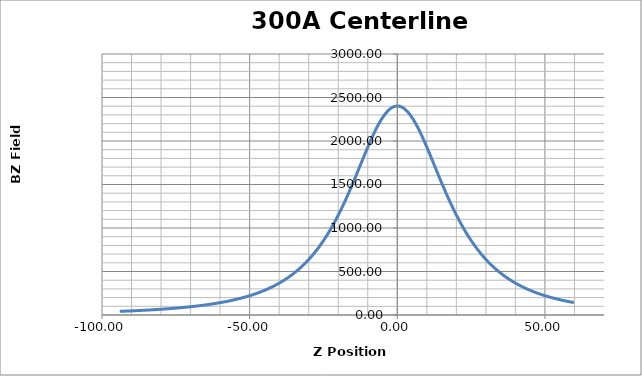
| Category | Series 0 |
|---|---|
| -94.001 | 41.99 |
| -93.8 | 42.26 |
| -93.602 | 42.48 |
| -93.403 | 42.77 |
| -93.202 | 43.03 |
| -93.001 | 43.31 |
| -92.804 | 43.57 |
| -92.604 | 43.82 |
| -92.403 | 44.13 |
| -92.203 | 44.38 |
| -92.006 | 44.63 |
| -91.806 | 44.94 |
| -91.60300000000001 | 45.21 |
| -91.402 | 45.51 |
| -91.205 | 45.77 |
| -91.004 | 46.05 |
| -90.802 | 46.33 |
| -90.602 | 46.63 |
| -90.405 | 46.95 |
| -90.20400000000001 | 47.26 |
| -90.004 | 47.52 |
| -89.804 | 47.85 |
| -89.607 | 48.15 |
| -89.406 | 48.44 |
| -89.20400000000001 | 48.76 |
| -89.003 | 49.09 |
| -88.806 | 49.36 |
| -88.605 | 49.69 |
| -88.404 | 50.02 |
| -88.20400000000001 | 50.33 |
| -88.005 | 50.64 |
| -87.805 | 51 |
| -87.604 | 51.31 |
| -87.404 | 51.64 |
| -87.208 | 52 |
| -87.007 | 52.29 |
| -86.805 | 52.66 |
| -86.604 | 52.99 |
| -86.406 | 53.37 |
| -86.206 | 53.71 |
| -86.004 | 54.07 |
| -85.804 | 54.41 |
| -85.606 | 54.75 |
| -85.405 | 55.13 |
| -85.20400000000001 | 55.47 |
| -85.004 | 55.88 |
| -84.807 | 56.22 |
| -84.607 | 56.62 |
| -84.406 | 56.98 |
| -84.20400000000001 | 57.37 |
| -84.006 | 57.77 |
| -83.806 | 58.12 |
| -83.604 | 58.53 |
| -83.403 | 58.95 |
| -83.205 | 59.33 |
| -83.006 | 59.74 |
| -82.803 | 60.15 |
| -82.60300000000001 | 60.53 |
| -82.406 | 60.94 |
| -82.20700000000001 | 61.34 |
| -82.006 | 61.76 |
| -81.805 | 62.19 |
| -81.607 | 62.61 |
| -81.407 | 63.05 |
| -81.205 | 63.49 |
| -81.005 | 63.93 |
| -80.806 | 64.38 |
| -80.606 | 64.8 |
| -80.405 | 65.25 |
| -80.20400000000001 | 65.71 |
| -80.007 | 66.17 |
| -79.807 | 66.62 |
| -79.607 | 67.08 |
| -79.406 | 67.56 |
| -79.209 | 68.02 |
| -79.00800000000001 | 68.46 |
| -78.806 | 68.94 |
| -78.605 | 69.45 |
| -78.407 | 69.92 |
| -78.20700000000001 | 70.43 |
| -78.005 | 70.91 |
| -77.804 | 71.45 |
| -77.607 | 71.95 |
| -77.408 | 72.44 |
| -77.207 | 72.98 |
| -77.007 | 73.47 |
| -76.809 | 74.02 |
| -76.60900000000001 | 74.57 |
| -76.406 | 75.11 |
| -76.205 | 75.62 |
| -76.007 | 76.17 |
| -75.807 | 76.71 |
| -75.606 | 77.27 |
| -75.404 | 77.82 |
| -75.207 | 78.4 |
| -75.00800000000001 | 78.94 |
| -74.806 | 79.53 |
| -74.605 | 80.1 |
| -74.409 | 80.68 |
| -74.208 | 81.26 |
| -74.006 | 81.87 |
| -73.805 | 82.46 |
| -73.607 | 83.08 |
| -73.40700000000001 | 83.7 |
| -73.206 | 84.31 |
| -73.005 | 85 |
| -72.807 | 85.58 |
| -72.607 | 86.2 |
| -72.406 | 86.85 |
| -72.205 | 87.45 |
| -72.00800000000001 | 88.13 |
| -71.809 | 88.77 |
| -71.607 | 89.47 |
| -71.406 | 90.14 |
| -71.207 | 90.81 |
| -71.00800000000001 | 91.5 |
| -70.806 | 92.22 |
| -70.605 | 92.92 |
| -70.40700000000001 | 93.61 |
| -70.208 | 94.29 |
| -70.006 | 95 |
| -69.804 | 95.77 |
| -69.608 | 96.47 |
| -69.409 | 97.24 |
| -69.207 | 97.97 |
| -69.006 | 98.74 |
| -68.808 | 99.48 |
| -68.608 | 100.25 |
| -68.405 | 101.07 |
| -68.20400000000001 | 101.83 |
| -68.006 | 102.62 |
| -67.807 | 103.43 |
| -67.606 | 104.23 |
| -67.405 | 105.07 |
| -67.206 | 105.88 |
| -67.00800000000001 | 106.71 |
| -66.807 | 107.55 |
| -66.607 | 108.41 |
| -66.408 | 109.25 |
| -66.208 | 110.15 |
| -66.006 | 111.02 |
| -65.805 | 111.88 |
| -65.606 | 112.79 |
| -65.408 | 113.68 |
| -65.207 | 114.61 |
| -65.006 | 115.54 |
| -64.806 | 116.48 |
| -64.60900000000001 | 117.38 |
| -64.408 | 118.33 |
| -64.207 | 119.32 |
| -64.00800000000001 | 120.26 |
| -63.81 | 121.21 |
| -63.607 | 122.2 |
| -63.405 | 123.24 |
| -63.206 | 124.24 |
| -63.008 | 125.22 |
| -62.807 | 126.28 |
| -62.605000000000004 | 127.34 |
| -62.407000000000004 | 128.39 |
| -62.209 | 129.42 |
| -62.008 | 130.48 |
| -61.807 | 131.59 |
| -61.608000000000004 | 132.67 |
| -61.411 | 133.75 |
| -61.208000000000006 | 134.9 |
| -61.006 | 136.06 |
| -60.806000000000004 | 137.2 |
| -60.608000000000004 | 138.35 |
| -60.406 | 139.5 |
| -60.205000000000005 | 140.71 |
| -60.007000000000005 | 141.87 |
| -59.809000000000005 | 143.09 |
| -59.608000000000004 | 144.31 |
| -59.407000000000004 | 145.55 |
| -59.209 | 146.75 |
| -59.011 | 148.01 |
| -58.809000000000005 | 149.3 |
| -58.607 | 150.58 |
| -58.407000000000004 | 151.89 |
| -58.208000000000006 | 153.2 |
| -58.007000000000005 | 154.53 |
| -57.805 | 155.89 |
| -57.606 | 157.25 |
| -57.408 | 158.63 |
| -57.208000000000006 | 160 |
| -57.006 | 161.43 |
| -56.808 | 162.8 |
| -56.611000000000004 | 164.19 |
| -56.411 | 165.66 |
| -56.208000000000006 | 167.19 |
| -56.009 | 168.62 |
| -55.81 | 170.14 |
| -55.608000000000004 | 171.67 |
| -55.406 | 173.23 |
| -55.206 | 174.75 |
| -55.009 | 176.28 |
| -54.808 | 177.88 |
| -54.607 | 179.47 |
| -54.409 | 181.11 |
| -54.212 | 182.69 |
| -54.010000000000005 | 184.36 |
| -53.809000000000005 | 186.03 |
| -53.609 | 187.73 |
| -53.410000000000004 | 189.44 |
| -53.208000000000006 | 191.22 |
| -53.005 | 192.94 |
| -52.806000000000004 | 194.75 |
| -52.608000000000004 | 196.5 |
| -52.408 | 198.31 |
| -52.206 | 200.17 |
| -52.008 | 202.01 |
| -51.811 | 203.85 |
| -51.61 | 205.8 |
| -51.408 | 207.7 |
| -51.209 | 209.63 |
| -51.010000000000005 | 211.61 |
| -50.808 | 213.61 |
| -50.606 | 215.63 |
| -50.406 | 217.7 |
| -50.208000000000006 | 219.74 |
| -50.007000000000005 | 221.83 |
| -49.806000000000004 | 223.93 |
| -49.607 | 226.08 |
| -49.410000000000004 | 228.2 |
| -49.209 | 230.35 |
| -49.008 | 232.57 |
| -48.808 | 234.84 |
| -48.61 | 237.08 |
| -48.408 | 239.39 |
| -48.206 | 241.75 |
| -48.005 | 244.1 |
| -47.808 | 246.42 |
| -47.607 | 248.84 |
| -47.405 | 251.29 |
| -47.206 | 253.72 |
| -47.010000000000005 | 256.19 |
| -46.809000000000005 | 258.73 |
| -46.608000000000004 | 261.3 |
| -46.409 | 263.86 |
| -46.211000000000006 | 266.45 |
| -46.009 | 269.12 |
| -45.807 | 271.84 |
| -45.606 | 274.57 |
| -45.409 | 277.3 |
| -45.207 | 280.06 |
| -45.006 | 282.89 |
| -44.806000000000004 | 285.75 |
| -44.609 | 288.59 |
| -44.408 | 291.54 |
| -44.207 | 294.5 |
| -44.008 | 297.5 |
| -43.81 | 300.49 |
| -43.609 | 303.57 |
| -43.407000000000004 | 306.68 |
| -43.207 | 309.82 |
| -43.009 | 312.96 |
| -42.808 | 316.22 |
| -42.606 | 319.52 |
| -42.406 | 322.82 |
| -42.209 | 326.12 |
| -42.008 | 329.51 |
| -41.806000000000004 | 332.99 |
| -41.607 | 336.43 |
| -41.410000000000004 | 339.87 |
| -41.21 | 343.44 |
| -41.007000000000005 | 347.12 |
| -40.807 | 350.74 |
| -40.61 | 354.4 |
| -40.408 | 358.17 |
| -40.206 | 362 |
| -40.006 | 365.84 |
| -39.808 | 369.69 |
| -39.607 | 373.65 |
| -39.406 | 377.66 |
| -39.207 | 381.68 |
| -39.010000000000005 | 385.72 |
| -38.809000000000005 | 389.87 |
| -38.607 | 394.12 |
| -38.407000000000004 | 398.39 |
| -38.209 | 402.65 |
| -38.007000000000005 | 407.08 |
| -37.806000000000004 | 411.51 |
| -37.605000000000004 | 416.02 |
| -37.408 | 420.48 |
| -37.207 | 425.11 |
| -37.006 | 429.77 |
| -36.806000000000004 | 434.48 |
| -36.609 | 439.21 |
| -36.409 | 444.06 |
| -36.207 | 448.98 |
| -36.007000000000005 | 453.95 |
| -35.809000000000005 | 458.94 |
| -35.608000000000004 | 464.08 |
| -35.406 | 469.29 |
| -35.205000000000005 | 474.53 |
| -35.008 | 479.79 |
| -34.808 | 485.15 |
| -34.605000000000004 | 490.67 |
| -34.406 | 496.16 |
| -34.209 | 501.65 |
| -34.008 | 507.38 |
| -33.807 | 513.14 |
| -33.607 | 518.89 |
| -33.409 | 524.7 |
| -33.208000000000006 | 530.72 |
| -33.006 | 536.78 |
| -32.805 | 542.92 |
| -32.608000000000004 | 549.08 |
| -32.408 | 555.37 |
| -32.206 | 561.75 |
| -32.005 | 568.24 |
| -31.808 | 574.67 |
| -31.608000000000004 | 581.29 |
| -31.408 | 588.02 |
| -31.207 | 594.81 |
| -31.010000000000005 | 601.59 |
| -30.809000000000005 | 608.55 |
| -30.607 | 615.68 |
| -30.407000000000004 | 622.88 |
| -30.209000000000003 | 629.97 |
| -30.009 | 637.34 |
| -29.807000000000002 | 644.86 |
| -29.60600000000001 | 652.41 |
| -29.409000000000006 | 659.92 |
| -29.209000000000003 | 667.65 |
| -29.007000000000005 | 675.52 |
| -28.807000000000002 | 683.43 |
| -28.61 | 691.35 |
| -28.409999999999997 | 699.48 |
| -28.207000000000008 | 707.79 |
| -28.007000000000005 | 716.17 |
| -27.808999999999997 | 724.51 |
| -27.60900000000001 | 733.1 |
| -27.406999999999996 | 741.85 |
| -27.207000000000008 | 750.62 |
| -27.009 | 759.36 |
| -26.808999999999997 | 768.36 |
| -26.607 | 777.56 |
| -26.406999999999996 | 786.76 |
| -26.210000000000008 | 795.97 |
| -26.009 | 805.41 |
| -25.807000000000002 | 815.09 |
| -25.607 | 824.77 |
| -25.409000000000006 | 834.43 |
| -25.209000000000003 | 844.42 |
| -25.007000000000005 | 854.53 |
| -24.805999999999997 | 864.74 |
| -24.608000000000004 | 874.94 |
| -24.408 | 885.31 |
| -24.206000000000003 | 895.93 |
| -24.006 | 906.55 |
| -23.808999999999997 | 917.22 |
| -23.61 | 928.08 |
| -23.408 | 939.22 |
| -23.207000000000008 | 950.47 |
| -23.009 | 961.62 |
| -22.808999999999997 | 973.12 |
| -22.607 | 984.76 |
| -22.406000000000006 | 996.51 |
| -22.208 | 1008.2 |
| -22.007999999999996 | 1020.21 |
| -21.805999999999997 | 1032.39 |
| -21.60600000000001 | 1044.66 |
| -21.409000000000006 | 1056.77 |
| -21.209000000000003 | 1069.28 |
| -21.007999999999996 | 1081.95 |
| -20.807000000000002 | 1094.78 |
| -20.61 | 1107.49 |
| -20.409000000000006 | 1120.57 |
| -20.207000000000008 | 1133.87 |
| -20.006 | 1147.2 |
| -19.808999999999997 | 1160.43 |
| -19.608000000000004 | 1174 |
| -19.406000000000006 | 1187.8 |
| -19.205 | 1201.64 |
| -19.007000000000005 | 1215.44 |
| -18.808000000000007 | 1229.42 |
| -18.607 | 1243.66 |
| -18.406999999999996 | 1257.99 |
| -18.209000000000003 | 1272.29 |
| -18.009 | 1286.83 |
| -17.805999999999997 | 1301.66 |
| -17.60600000000001 | 1316.48 |
| -17.408 | 1331.21 |
| -17.208 | 1346.23 |
| -17.006 | 1361.49 |
| -16.805000000000007 | 1376.78 |
| -16.608000000000004 | 1391.95 |
| -16.408 | 1407.36 |
| -16.206000000000003 | 1423.02 |
| -16.006 | 1438.72 |
| -15.808999999999997 | 1454.17 |
| -15.608000000000004 | 1470.05 |
| -15.406000000000006 | 1486.12 |
| -15.204999999999998 | 1502.19 |
| -15.007999999999996 | 1518.04 |
| -14.808000000000007 | 1534.17 |
| -14.606000000000009 | 1550.54 |
| -14.405000000000001 | 1566.87 |
| -14.207999999999998 | 1583 |
| -14.007999999999996 | 1599.38 |
| -13.805999999999997 | 1615.87 |
| -13.606000000000009 | 1632.4 |
| -13.408000000000001 | 1648.73 |
| -13.209000000000003 | 1665.2 |
| -13.007000000000005 | 1681.92 |
| -12.805000000000007 | 1698.65 |
| -12.607 | 1715.06 |
| -12.408000000000001 | 1731.52 |
| -12.206000000000003 | 1748.22 |
| -12.006 | 1764.88 |
| -11.807000000000002 | 1781.24 |
| -11.608000000000004 | 1797.7 |
| -11.406000000000006 | 1814.35 |
| -11.204999999999998 | 1830.84 |
| -11.007000000000005 | 1847.01 |
| -10.808999999999997 | 1863.21 |
| -10.606000000000009 | 1879.7 |
| -10.405000000000001 | 1895.96 |
| -10.207000000000008 | 1911.89 |
| -10.007999999999996 | 1927.78 |
| -9.805999999999997 | 1943.77 |
| -9.605000000000004 | 1959.58 |
| -9.408000000000001 | 1975.05 |
| -9.207999999999998 | 1990.52 |
| -9.006 | 2005.98 |
| -8.805000000000007 | 2021.24 |
| -8.608000000000004 | 2036.03 |
| -8.408000000000001 | 2050.87 |
| -8.206000000000003 | 2065.66 |
| -8.004999999999995 | 2080.22 |
| -7.807000000000002 | 2094.42 |
| -7.606999999999999 | 2108.47 |
| -7.405000000000001 | 2122.44 |
| -7.204999999999998 | 2136.04 |
| -7.007000000000005 | 2149.33 |
| -6.808000000000007 | 2162.36 |
| -6.606000000000009 | 2175.37 |
| -6.406000000000006 | 2187.94 |
| -6.207999999999998 | 2200.18 |
| -6.009 | 2212.13 |
| -5.807000000000002 | 2223.92 |
| -5.606000000000009 | 2235.4 |
| -5.4069999999999965 | 2246.44 |
| -5.207999999999998 | 2257.21 |
| -5.006 | 2267.71 |
| -4.805000000000007 | 2277.94 |
| -4.606999999999999 | 2287.54 |
| -4.408000000000001 | 2296.93 |
| -4.206000000000003 | 2306.06 |
| -4.0049999999999955 | 2314.77 |
| -3.808000000000007 | 2322.95 |
| -3.608000000000004 | 2330.79 |
| -3.4069999999999965 | 2338.39 |
| -3.206000000000003 | 2345.51 |
| -3.007000000000005 | 2352.19 |
| -2.808000000000007 | 2358.52 |
| -2.6069999999999993 | 2364.47 |
| -2.405000000000001 | 2369.96 |
| -2.207000000000008 | 2375 |
| -2.0079999999999956 | 2379.65 |
| -1.8059999999999974 | 2383.88 |
| -1.6039999999999992 | 2387.68 |
| -1.406000000000006 | 2390.98 |
| -1.2079999999999984 | 2393.89 |
| -1.007000000000005 | 2396.39 |
| -0.8059999999999974 | 2398.42 |
| -0.6080000000000041 | 2399.96 |
| -0.40800000000000125 | 2401.1 |
| -0.20600000000000307 | 2401.81 |
| -0.0049999999999954525 | 2402.11 |
| 0.19299999999999784 | 2401.87 |
| 0.3919999999999959 | 2401.27 |
| 0.5939999999999941 | 2400.16 |
| 0.7950000000000017 | 2398.63 |
| 0.992999999999995 | 2396.68 |
| 1.191999999999993 | 2394.3 |
| 1.3930000000000007 | 2391.43 |
| 1.593999999999994 | 2388.11 |
| 1.7920000000000016 | 2384.44 |
| 1.9909999999999997 | 2380.3 |
| 2.192999999999998 | 2375.72 |
| 2.394999999999996 | 2370.65 |
| 2.5930000000000035 | 2365.29 |
| 2.7920000000000016 | 2359.47 |
| 2.992999999999995 | 2353.15 |
| 3.194999999999993 | 2346.47 |
| 3.394999999999996 | 2339.38 |
| 3.5919999999999987 | 2332.03 |
| 3.793999999999997 | 2324.16 |
| 3.9950000000000045 | 2315.86 |
| 4.192999999999998 | 2307.35 |
| 4.390999999999991 | 2298.45 |
| 4.5930000000000035 | 2289.05 |
| 4.793999999999997 | 2279.3 |
| 4.994 | 2269.26 |
| 5.191999999999993 | 2258.99 |
| 5.393000000000001 | 2248.25 |
| 5.593999999999994 | 2237.14 |
| 5.793999999999997 | 2225.74 |
| 5.992000000000004 | 2214.18 |
| 6.192999999999998 | 2202.17 |
| 6.393999999999991 | 2189.86 |
| 6.593999999999994 | 2177.37 |
| 6.790999999999997 | 2164.75 |
| 6.992999999999995 | 2151.57 |
| 7.194000000000003 | 2138.11 |
| 7.393999999999991 | 2124.58 |
| 7.591999999999999 | 2110.84 |
| 7.792999999999992 | 2096.73 |
| 7.9950000000000045 | 2082.4 |
| 8.194000000000003 | 2067.99 |
| 8.391999999999996 | 2053.48 |
| 8.593000000000004 | 2038.59 |
| 8.793999999999997 | 2023.54 |
| 8.994 | 2008.38 |
| 9.191000000000003 | 1993.27 |
| 9.393 | 1977.69 |
| 9.593999999999994 | 1961.94 |
| 9.793999999999997 | 1946.23 |
| 9.992000000000004 | 1930.46 |
| 10.194000000000003 | 1914.43 |
| 10.393999999999991 | 1898.27 |
| 10.593999999999994 | 1882.13 |
| 10.792000000000002 | 1866.11 |
| 10.992999999999995 | 1849.73 |
| 11.194000000000003 | 1833.26 |
| 11.393999999999991 | 1816.81 |
| 11.590999999999994 | 1800.58 |
| 11.792000000000002 | 1784.03 |
| 11.992999999999995 | 1767.45 |
| 12.192999999999998 | 1750.92 |
| 12.391999999999996 | 1734.43 |
| 12.593000000000004 | 1717.82 |
| 12.795000000000002 | 1701.11 |
| 12.992999999999995 | 1684.65 |
| 13.191000000000003 | 1668.25 |
| 13.393 | 1651.67 |
| 13.594999999999999 | 1635 |
| 13.793999999999997 | 1618.57 |
| 13.992000000000004 | 1602.35 |
| 14.192999999999998 | 1585.9 |
| 14.393999999999991 | 1569.56 |
| 14.593000000000004 | 1553.32 |
| 14.790999999999997 | 1537.32 |
| 14.992999999999995 | 1521.08 |
| 15.194000000000003 | 1504.88 |
| 15.393999999999991 | 1488.88 |
| 15.590999999999994 | 1473.26 |
| 15.792999999999992 | 1457.32 |
| 15.994 | 1441.49 |
| 16.194000000000003 | 1425.83 |
| 16.391999999999996 | 1410.48 |
| 16.593000000000004 | 1394.98 |
| 16.793999999999997 | 1379.49 |
| 16.992999999999995 | 1364.37 |
| 17.189999999999998 | 1349.45 |
| 17.391999999999996 | 1334.35 |
| 17.593999999999994 | 1319.29 |
| 17.793999999999997 | 1304.52 |
| 17.992000000000004 | 1289.94 |
| 18.192999999999998 | 1275.39 |
| 18.39399999999999 | 1260.89 |
| 18.593000000000004 | 1246.58 |
| 18.790999999999997 | 1232.54 |
| 18.992000000000004 | 1218.45 |
| 19.192999999999998 | 1204.39 |
| 19.393 | 1190.65 |
| 19.589 | 1177.19 |
| 19.790999999999997 | 1163.55 |
| 19.992999999999995 | 1150 |
| 20.192999999999998 | 1136.72 |
| 20.39 | 1123.72 |
| 20.590999999999994 | 1110.68 |
| 20.792999999999992 | 1097.65 |
| 20.992999999999995 | 1084.89 |
| 21.189999999999998 | 1072.42 |
| 21.39099999999999 | 1059.83 |
| 21.593000000000004 | 1047.42 |
| 21.792 | 1035.16 |
| 21.989000000000004 | 1023.32 |
| 22.191000000000003 | 1011.21 |
| 22.391999999999996 | 999.29 |
| 22.592 | 987.57 |
| 22.789999999999992 | 976.09 |
| 22.991 | 964.61 |
| 23.191999999999993 | 953.22 |
| 23.393 | 942.02 |
| 23.590000000000003 | 931.12 |
| 23.790999999999997 | 920.11 |
| 23.992999999999995 | 909.18 |
| 24.191999999999993 | 898.54 |
| 24.39 | 888.12 |
| 24.590999999999994 | 877.68 |
| 24.792 | 867.22 |
| 24.992000000000004 | 857.06 |
| 25.189999999999998 | 847.08 |
| 25.39099999999999 | 837.09 |
| 25.593000000000004 | 827.2 |
| 25.792999999999992 | 817.5 |
| 25.989999999999995 | 808 |
| 26.191000000000003 | 798.5 |
| 26.393 | 789.08 |
| 26.593000000000004 | 779.87 |
| 26.789999999999992 | 770.85 |
| 26.991 | 761.79 |
| 27.192999999999998 | 752.84 |
| 27.393 | 744.02 |
| 27.590999999999994 | 735.47 |
| 27.792 | 726.84 |
| 27.992999999999995 | 718.33 |
| 28.192999999999998 | 709.99 |
| 28.39099999999999 | 701.8 |
| 28.592 | 693.65 |
| 28.792999999999992 | 685.48 |
| 28.992999999999995 | 677.58 |
| 29.191000000000003 | 669.79 |
| 29.391999999999996 | 662.03 |
| 29.593999999999994 | 654.3 |
| 29.793999999999997 | 646.79 |
| 29.991 | 639.36 |
| 30.191999999999993 | 632.02 |
| 30.39399999999999 | 624.67 |
| 30.593000000000004 | 617.56 |
| 30.789999999999992 | 610.55 |
| 30.991 | 603.51 |
| 31.192999999999998 | 596.6 |
| 31.393 | 589.77 |
| 31.590999999999994 | 583.1 |
| 31.792 | 576.44 |
| 31.994 | 569.82 |
| 32.194 | 563.36 |
| 32.39099999999999 | 557.08 |
| 32.592 | 550.76 |
| 32.794 | 544.5 |
| 32.995000000000005 | 538.34 |
| 33.19199999999999 | 532.38 |
| 33.391999999999996 | 526.38 |
| 33.593999999999994 | 520.42 |
| 33.794 | 514.58 |
| 33.990999999999985 | 508.89 |
| 34.19200000000001 | 503.17 |
| 34.394000000000005 | 497.51 |
| 34.593999999999994 | 491.97 |
| 34.792 | 486.59 |
| 34.992999999999995 | 481.18 |
| 35.19499999999999 | 475.84 |
| 35.39500000000001 | 470.58 |
| 35.59299999999999 | 465.45 |
| 35.792 | 460.37 |
| 35.994 | 455.28 |
| 36.19399999999999 | 450.26 |
| 36.39099999999999 | 445.39 |
| 36.591999999999985 | 440.49 |
| 36.79400000000001 | 435.7 |
| 36.995000000000005 | 430.91 |
| 37.192999999999984 | 426.25 |
| 37.393 | 421.65 |
| 37.595 | 417.07 |
| 37.79599999999999 | 412.55 |
| 37.992999999999995 | 408.13 |
| 38.192999999999984 | 403.73 |
| 38.394000000000005 | 399.42 |
| 38.593999999999994 | 395.13 |
| 38.791 | 390.97 |
| 38.99199999999999 | 386.81 |
| 39.19399999999999 | 382.67 |
| 39.39500000000001 | 378.59 |
| 39.59299999999999 | 374.63 |
| 39.79400000000001 | 370.64 |
| 39.99600000000001 | 366.7 |
| 40.196 | 362.82 |
| 40.394000000000005 | 359.03 |
| 40.593999999999994 | 355.3 |
| 40.79499999999999 | 351.57 |
| 40.99600000000001 | 347.87 |
| 41.192999999999984 | 344.27 |
| 41.393 | 340.72 |
| 41.595 | 337.14 |
| 41.79499999999999 | 333.64 |
| 41.99199999999999 | 330.24 |
| 42.192999999999984 | 326.84 |
| 42.394000000000005 | 323.47 |
| 42.593999999999994 | 320.14 |
| 42.793000000000006 | 316.85 |
| 42.994 | 313.61 |
| 43.19499999999999 | 310.43 |
| 43.39500000000001 | 307.24 |
| 43.591999999999985 | 304.17 |
| 43.791 | 301.08 |
| 43.992999999999995 | 297.98 |
| 44.19399999999999 | 294.99 |
| 44.391999999999996 | 292.07 |
| 44.59299999999999 | 289.1 |
| 44.79400000000001 | 286.18 |
| 44.995000000000005 | 283.35 |
| 45.19200000000001 | 280.51 |
| 45.393 | 277.74 |
| 45.59299999999999 | 274.95 |
| 45.79400000000001 | 272.23 |
| 45.99199999999999 | 269.55 |
| 46.19200000000001 | 266.9 |
| 46.393 | 264.28 |
| 46.593999999999994 | 261.66 |
| 46.792 | 259.11 |
| 46.99199999999999 | 256.6 |
| 47.19399999999999 | 254.06 |
| 47.394000000000005 | 251.54 |
| 47.591999999999985 | 249.15 |
| 47.793000000000006 | 246.73 |
| 47.995000000000005 | 244.35 |
| 48.19399999999999 | 242 |
| 48.393 | 239.67 |
| 48.591999999999985 | 237.38 |
| 48.79400000000001 | 235.11 |
| 48.995000000000005 | 232.84 |
| 49.19200000000001 | 230.65 |
| 49.391999999999996 | 228.46 |
| 49.593999999999994 | 226.29 |
| 49.79599999999999 | 224.15 |
| 49.992999999999995 | 222.03 |
| 50.19200000000001 | 219.93 |
| 50.394000000000005 | 217.88 |
| 50.593999999999994 | 215.83 |
| 50.792 | 213.82 |
| 50.99199999999999 | 211.85 |
| 51.19399999999999 | 209.82 |
| 51.39500000000001 | 207.85 |
| 51.59299999999999 | 205.97 |
| 51.792 | 204.06 |
| 51.994 | 202.16 |
| 52.19499999999999 | 200.3 |
| 52.393 | 198.47 |
| 52.591999999999985 | 196.7 |
| 52.79400000000001 | 194.85 |
| 52.995000000000005 | 193.09 |
| 53.192999999999984 | 191.33 |
| 53.391999999999996 | 189.59 |
| 53.593999999999994 | 187.87 |
| 53.79499999999999 | 186.14 |
| 53.992999999999995 | 184.49 |
| 54.192999999999984 | 182.83 |
| 54.394000000000005 | 181.16 |
| 54.593999999999994 | 179.56 |
| 54.792 | 177.97 |
| 54.992999999999995 | 176.4 |
| 55.19499999999999 | 174.84 |
| 55.39599999999999 | 173.25 |
| 55.593999999999994 | 171.73 |
| 55.792 | 170.21 |
| 55.995000000000005 | 168.69 |
| 56.19499999999999 | 167.21 |
| 56.393 | 165.74 |
| 56.59299999999999 | 164.31 |
| 56.79499999999999 | 162.85 |
| 56.994 | 161.44 |
| 57.19200000000001 | 160.07 |
| 57.393 | 158.66 |
| 57.593999999999994 | 157.31 |
| 57.79400000000001 | 155.93 |
| 57.99199999999999 | 154.62 |
| 58.19200000000001 | 153.25 |
| 58.39500000000001 | 151.94 |
| 58.595 | 150.64 |
| 58.793000000000006 | 149.36 |
| 58.992999999999995 | 148.07 |
| 59.19399999999999 | 146.79 |
| 59.394000000000005 | 145.57 |
| 59.591999999999985 | 144.36 |
| 59.792 | 143.15 |
| 59.994 | 141.95 |